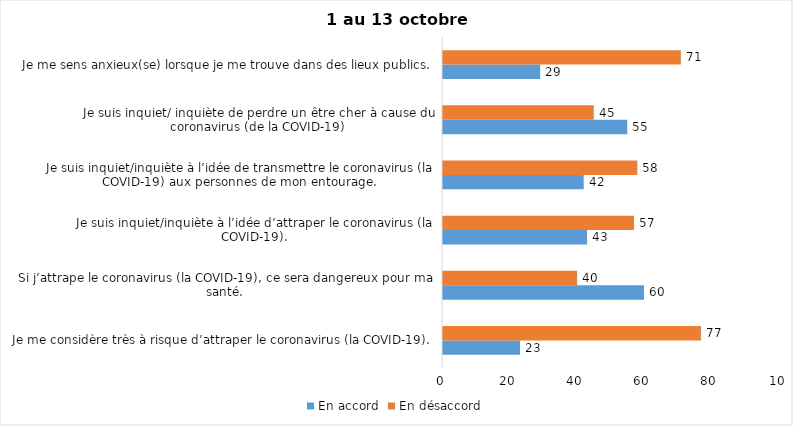
| Category | En accord | En désaccord |
|---|---|---|
| Je me considère très à risque d’attraper le coronavirus (la COVID-19). | 23 | 77 |
| Si j’attrape le coronavirus (la COVID-19), ce sera dangereux pour ma santé. | 60 | 40 |
| Je suis inquiet/inquiète à l’idée d’attraper le coronavirus (la COVID-19). | 43 | 57 |
| Je suis inquiet/inquiète à l’idée de transmettre le coronavirus (la COVID-19) aux personnes de mon entourage. | 42 | 58 |
| Je suis inquiet/ inquiète de perdre un être cher à cause du coronavirus (de la COVID-19) | 55 | 45 |
| Je me sens anxieux(se) lorsque je me trouve dans des lieux publics. | 29 | 71 |